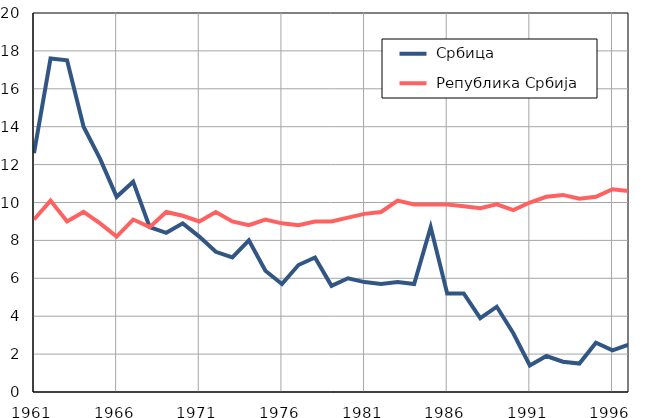
| Category |  Србица |  Република Србија |
|---|---|---|
| 1961.0 | 12.6 | 9.1 |
| 1962.0 | 17.6 | 10.1 |
| 1963.0 | 17.5 | 9 |
| 1964.0 | 14 | 9.5 |
| 1965.0 | 12.3 | 8.9 |
| 1966.0 | 10.3 | 8.2 |
| 1967.0 | 11.1 | 9.1 |
| 1968.0 | 8.7 | 8.7 |
| 1969.0 | 8.4 | 9.5 |
| 1970.0 | 8.9 | 9.3 |
| 1971.0 | 8.2 | 9 |
| 1972.0 | 7.4 | 9.5 |
| 1973.0 | 7.1 | 9 |
| 1974.0 | 8 | 8.8 |
| 1975.0 | 6.4 | 9.1 |
| 1976.0 | 5.7 | 8.9 |
| 1977.0 | 6.7 | 8.8 |
| 1978.0 | 7.1 | 9 |
| 1979.0 | 5.6 | 9 |
| 1980.0 | 6 | 9.2 |
| 1981.0 | 5.8 | 9.4 |
| 1982.0 | 5.7 | 9.5 |
| 1983.0 | 5.8 | 10.1 |
| 1984.0 | 5.7 | 9.9 |
| 1985.0 | 8.7 | 9.9 |
| 1986.0 | 5.2 | 9.9 |
| 1987.0 | 5.2 | 9.8 |
| 1988.0 | 3.9 | 9.7 |
| 1989.0 | 4.5 | 9.9 |
| 1990.0 | 3.1 | 9.6 |
| 1991.0 | 1.4 | 10 |
| 1992.0 | 1.9 | 10.3 |
| 1993.0 | 1.6 | 10.4 |
| 1994.0 | 1.5 | 10.2 |
| 1995.0 | 2.6 | 10.3 |
| 1996.0 | 2.2 | 10.7 |
| 1997.0 | 2.5 | 10.6 |